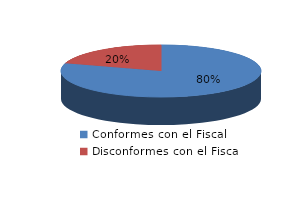
| Category | Series 0 |
|---|---|
| 0 | 1728 |
| 1 | 439 |